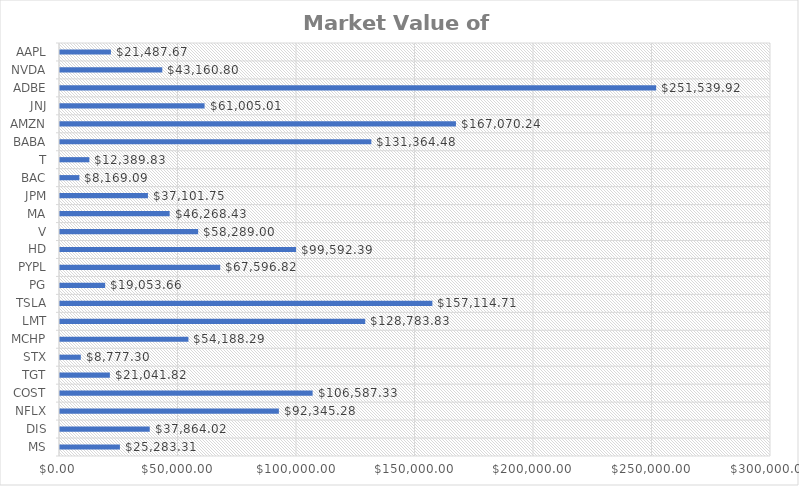
| Category | Series 0 |
|---|---|
| AAPL | 21487.67 |
| NVDA | 43160.8 |
| ADBE | 251539.92 |
| JNJ | 61005.005 |
| AMZN | 167070.24 |
| BABA | 131364.48 |
| T | 12389.825 |
| BAC | 8169.09 |
| JPM | 37101.75 |
| MA | 46268.43 |
| V | 58289 |
| HD | 99592.385 |
| PYPL | 67596.82 |
| PG | 19053.66 |
| TSLA | 157114.71 |
| LMT | 128783.825 |
| MCHP | 54188.29 |
| STX | 8777.297 |
| TGT | 21041.82 |
| COST | 106587.33 |
| NFLX | 92345.28 |
| DIS | 37864.022 |
| MS | 25283.31 |